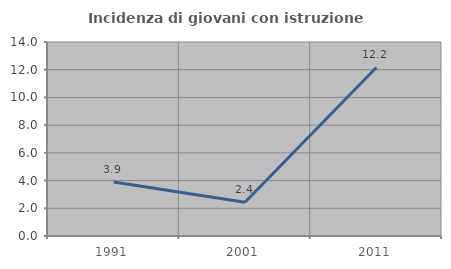
| Category | Incidenza di giovani con istruzione universitaria |
|---|---|
| 1991.0 | 3.896 |
| 2001.0 | 2.439 |
| 2011.0 | 12.162 |